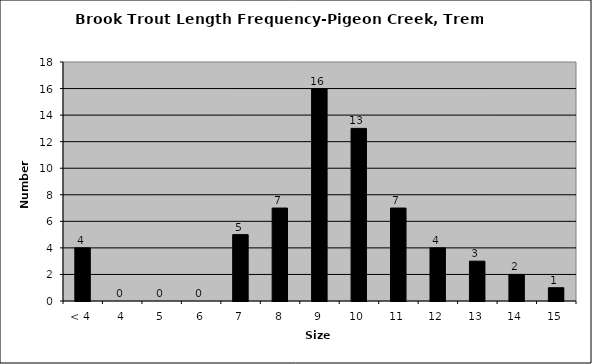
| Category | Series 0 |
|---|---|
| < 4 | 4 |
| 4 | 0 |
| 5 | 0 |
| 6 | 0 |
| 7 | 5 |
| 8 | 7 |
| 9 | 16 |
| 10 | 13 |
| 11 | 7 |
| 12 | 4 |
| 13 | 3 |
| 14 | 2 |
| 15 | 1 |